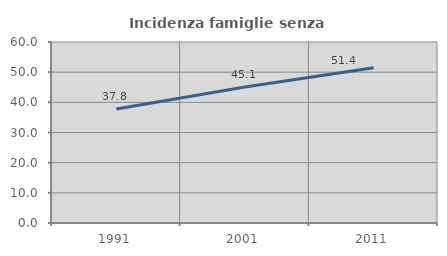
| Category | Incidenza famiglie senza nuclei |
|---|---|
| 1991.0 | 37.807 |
| 2001.0 | 45.091 |
| 2011.0 | 51.432 |